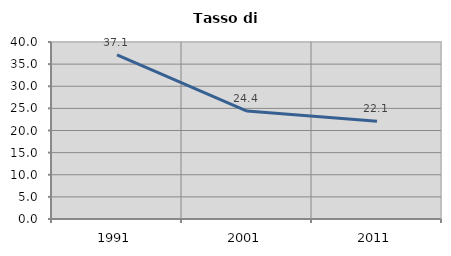
| Category | Tasso di disoccupazione   |
|---|---|
| 1991.0 | 37.112 |
| 2001.0 | 24.388 |
| 2011.0 | 22.074 |